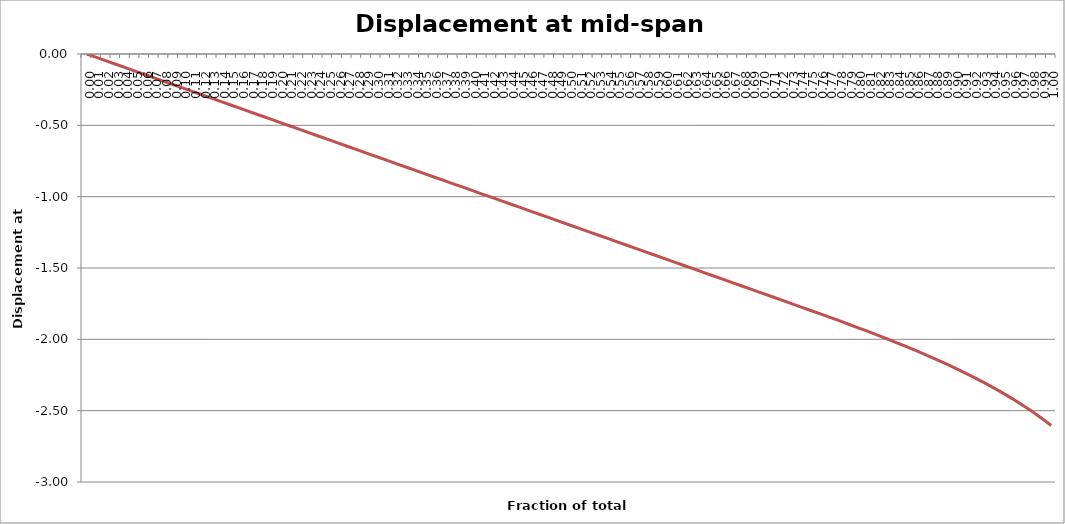
| Category | Displacement at mid-span [mm] |
|---|---|
| 0.0 | 0 |
| 0.01 | -0.024 |
| 0.02 | -0.048 |
| 0.03 | -0.072 |
| 0.04 | -0.096 |
| 0.05 | -0.12 |
| 0.06 | -0.144 |
| 0.06999999999999999 | -0.168 |
| 0.08 | -0.192 |
| 0.09 | -0.215 |
| 0.1 | -0.239 |
| 0.11000000000000001 | -0.263 |
| 0.12 | -0.287 |
| 0.13 | -0.311 |
| 0.13999999999999999 | -0.335 |
| 0.15 | -0.359 |
| 0.16 | -0.383 |
| 0.16999999999999998 | -0.407 |
| 0.18 | -0.431 |
| 0.19 | -0.455 |
| 0.2 | -0.479 |
| 0.21000000000000002 | -0.503 |
| 0.22000000000000003 | -0.527 |
| 0.22999999999999998 | -0.551 |
| 0.24 | -0.575 |
| 0.25 | -0.599 |
| 0.26 | -0.622 |
| 0.27 | -0.646 |
| 0.27999999999999997 | -0.67 |
| 0.29 | -0.694 |
| 0.3 | -0.718 |
| 0.31 | -0.742 |
| 0.32 | -0.766 |
| 0.32999999999999996 | -0.79 |
| 0.33999999999999997 | -0.814 |
| 0.35 | -0.838 |
| 0.36 | -0.862 |
| 0.37 | -0.886 |
| 0.38 | -0.91 |
| 0.39 | -0.934 |
| 0.4 | -0.958 |
| 0.41 | -0.982 |
| 0.42000000000000004 | -1.006 |
| 0.43 | -1.03 |
| 0.44000000000000006 | -1.053 |
| 0.45 | -1.077 |
| 0.45999999999999996 | -1.101 |
| 0.47000000000000003 | -1.125 |
| 0.48 | -1.149 |
| 0.49000000000000005 | -1.173 |
| 0.5 | -1.197 |
| 0.51 | -1.221 |
| 0.52 | -1.245 |
| 0.53 | -1.269 |
| 0.54 | -1.293 |
| 0.55 | -1.317 |
| 0.5599999999999999 | -1.341 |
| 0.5700000000000001 | -1.365 |
| 0.58 | -1.389 |
| 0.5900000000000001 | -1.412 |
| 0.6 | -1.436 |
| 0.61 | -1.46 |
| 0.62 | -1.484 |
| 0.63 | -1.508 |
| 0.64 | -1.532 |
| 0.65 | -1.556 |
| 0.6599999999999999 | -1.58 |
| 0.67 | -1.604 |
| 0.6799999999999999 | -1.628 |
| 0.6900000000000001 | -1.652 |
| 0.7 | -1.676 |
| 0.71 | -1.7 |
| 0.72 | -1.724 |
| 0.73 | -1.748 |
| 0.74 | -1.772 |
| 0.75 | -1.796 |
| 0.76 | -1.82 |
| 0.77 | -1.845 |
| 0.78 | -1.869 |
| 0.79 | -1.894 |
| 0.8 | -1.919 |
| 0.8099999999999999 | -1.945 |
| 0.82 | -1.971 |
| 0.8300000000000001 | -1.997 |
| 0.8400000000000001 | -2.024 |
| 0.85 | -2.052 |
| 0.86 | -2.08 |
| 0.8699999999999999 | -2.108 |
| 0.8800000000000001 | -2.138 |
| 0.89 | -2.169 |
| 0.9 | -2.2 |
| 0.9099999999999999 | -2.233 |
| 0.9199999999999999 | -2.267 |
| 0.93 | -2.302 |
| 0.9400000000000001 | -2.339 |
| 0.95 | -2.377 |
| 0.96 | -2.417 |
| 0.97 | -2.46 |
| 0.9800000000000001 | -2.505 |
| 0.99 | -2.553 |
| 1.0 | -2.604 |